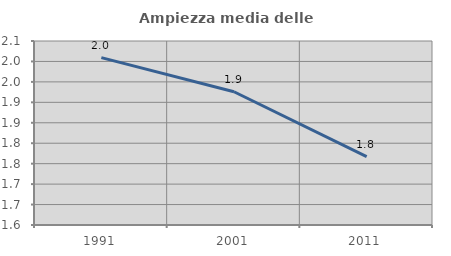
| Category | Ampiezza media delle famiglie |
|---|---|
| 1991.0 | 2.009 |
| 2001.0 | 1.926 |
| 2011.0 | 1.767 |